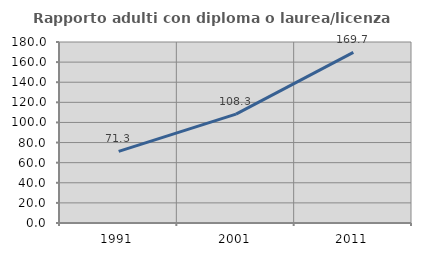
| Category | Rapporto adulti con diploma o laurea/licenza media  |
|---|---|
| 1991.0 | 71.277 |
| 2001.0 | 108.333 |
| 2011.0 | 169.697 |